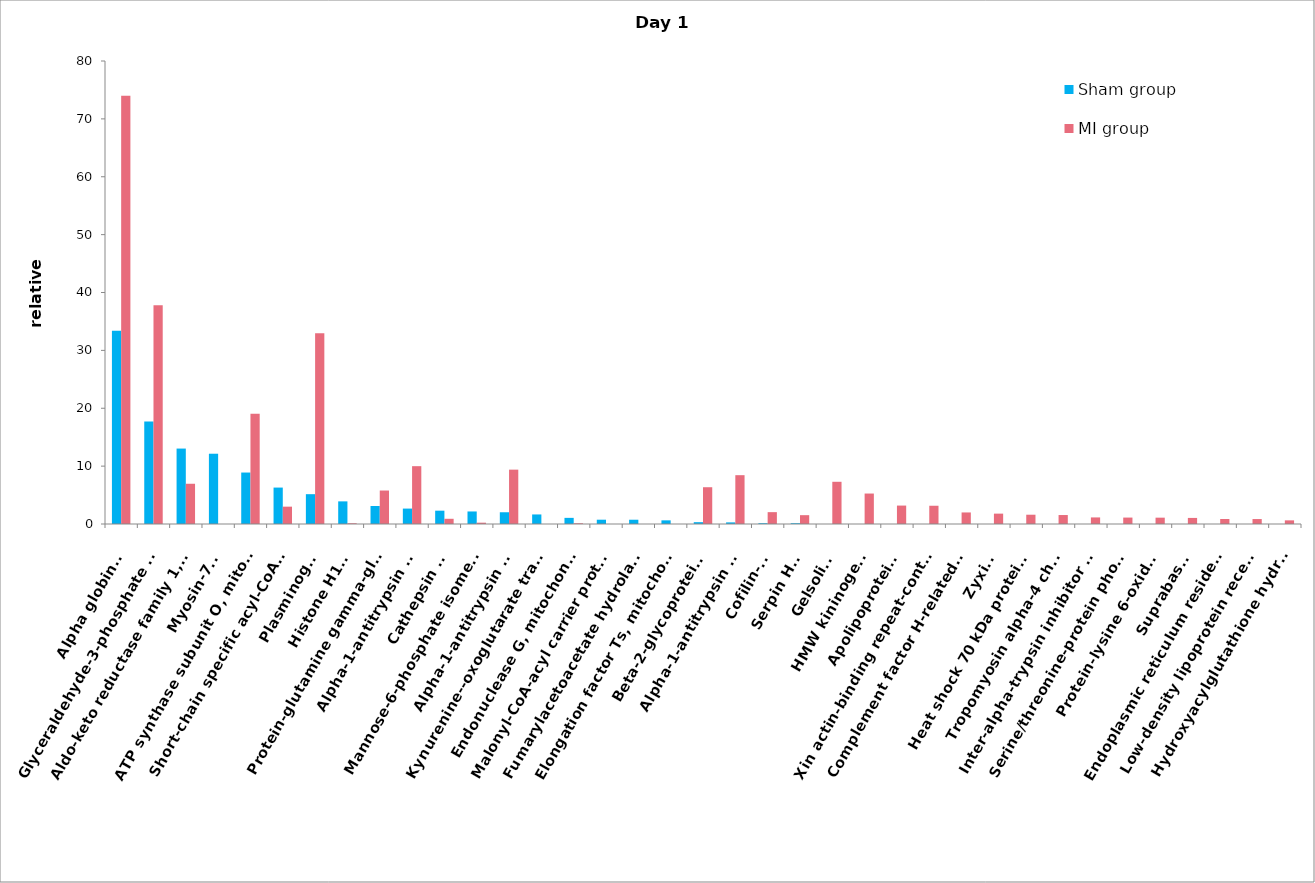
| Category | Sham group | MI group |
|---|---|---|
| Alpha globin 1  | 33.39 | 73.982 |
| Glyceraldehyde-3-phosphate dehydrogenase  | 17.704 | 37.816 |
| Aldo-keto reductase family 1, member B3 (Aldose reductase)  | 13.034 | 6.954 |
| Myosin-7B  | 12.142 | 0 |
| ATP synthase subunit O, mitochondrial  | 8.892 | 19.036 |
| Short-chain specific acyl-CoA dehydrogenase, mitochondrial  | 6.294 | 2.996 |
| Plasminogen  | 5.152 | 32.938 |
| Histone H1.0  | 3.91 | 0.13 |
| Protein-glutamine gamma-glutamyltransferase 2  | 3.11 | 5.784 |
| Alpha-1-antitrypsin 1-1  | 2.664 | 9.992 |
| Cathepsin D  | 2.302 | 0.9 |
| Mannose-6-phosphate isomerase  | 2.166 | 0.228 |
| Alpha-1-antitrypsin 1-4  | 2.03 | 9.392 |
| Kynurenine--oxoglutarate transaminase 3  | 1.65 | 0 |
| Endonuclease G, mitochondrial  | 1.06 | 0.13 |
| Malonyl-CoA-acyl carrier protein transacylase, mitochondrial  | 0.742 | 0 |
| Fumarylacetoacetate hydrolase domain-containing protein 2A  | 0.738 | 0 |
| Elongation factor Ts, mitochondrial  | 0.632 | 0 |
| Beta-2-glycoprotein 1  | 0.316 | 6.354 |
| Alpha-1-antitrypsin 1-5  | 0.28 | 8.436 |
| Cofilin-1  | 0.14 | 2.048 |
| Serpin H1  | 0.14 | 1.526 |
| Gelsolin  | 0 | 7.294 |
| HMW kininogen-II  | 0 | 5.264 |
| Apolipoprotein E  | 0 | 3.184 |
| Xin actin-binding repeat-containing protein 1  | 0 | 3.154 |
| Complement factor H-related protein C  | 0 | 1.996 |
| Zyxin  | 0 | 1.792 |
| Heat shock 70 kDa protein 1B  | 0 | 1.604 |
| Tropomyosin alpha-4 chain  | 0 | 1.55 |
| Inter-alpha-trypsin inhibitor heavy chain H3  | 0 | 1.136 |
| Serine/threonine-protein phosphatase 1 regulatory subunit 10  | 0 | 1.11 |
| Protein-lysine 6-oxidase  | 0 | 1.094 |
| Suprabasin  | 0 | 1.05 |
| Endoplasmic reticulum resident protein 44  | 0 | 0.868 |
| Low-density lipoprotein receptor-related protein 1B  | 0 | 0.856 |
| Hydroxyacylglutathione hydrolase, mitochondrial  | 0 | 0.63 |